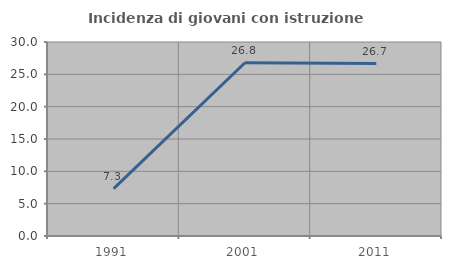
| Category | Incidenza di giovani con istruzione universitaria |
|---|---|
| 1991.0 | 7.317 |
| 2001.0 | 26.786 |
| 2011.0 | 26.667 |